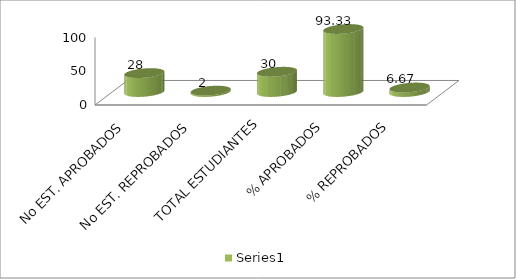
| Category | Series 0 |
|---|---|
| No EST. APROBADOS | 28 |
| No EST. REPROBADOS | 2 |
| TOTAL ESTUDIANTES | 30 |
| % APROBADOS | 93.333 |
| % REPROBADOS | 6.667 |